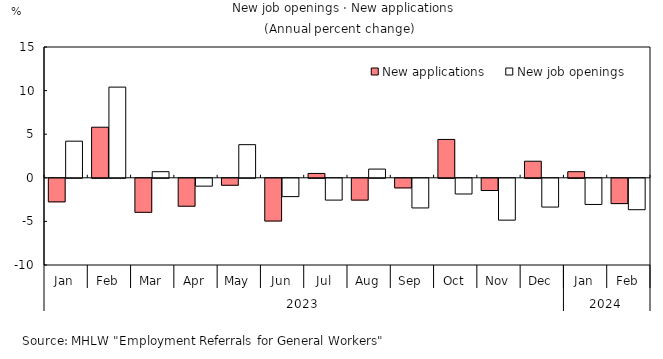
| Category | New applications | New job openings |
|---|---|---|
| 0 | -2.7 | 4.2 |
| 1 | 5.8 | 10.4 |
| 2 | -3.9 | 0.7 |
| 3 | -3.2 | -0.9 |
| 4 | -0.8 | 3.8 |
| 5 | -4.9 | -2.1 |
| 6 | 0.5 | -2.5 |
| 7 | -2.5 | 1 |
| 8 | -1.1 | -3.4 |
| 9 | 4.4 | -1.8 |
| 10 | -1.4 | -4.8 |
| 11 | 1.9 | -3.3 |
| 12 | 0.7 | -3 |
| 13 | -2.9 | -3.6 |